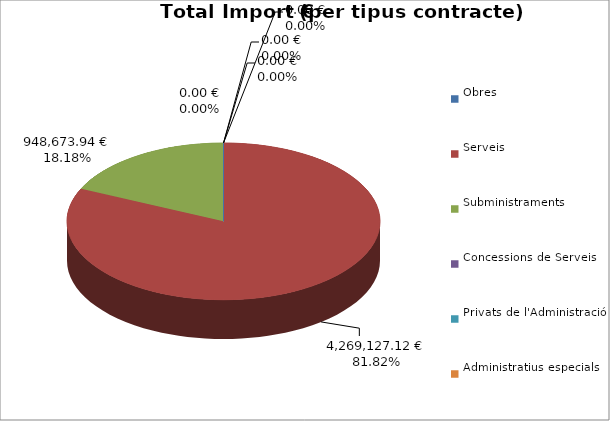
| Category | Total preu
(amb IVA) |
|---|---|
| Obres | 0 |
| Serveis | 4269127.12 |
| Subministraments | 948673.94 |
| Concessions de Serveis | 0 |
| Privats de l'Administració | 0 |
| Administratius especials | 0 |